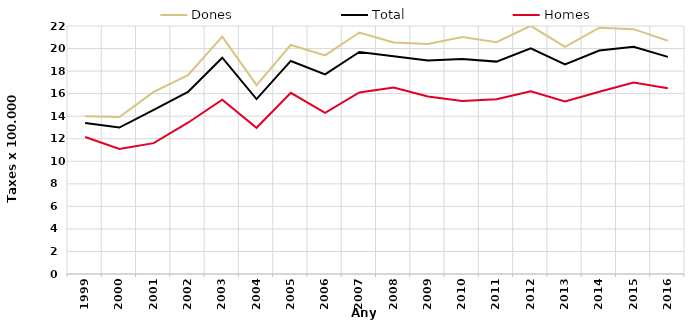
| Category | Dones | Total | Homes |
|---|---|---|---|
| 1999.0 | 14 | 13.39 | 12.15 |
| 2000.0 | 13.92 | 12.99 | 11.1 |
| 2001.0 | 16.16 | 14.56 | 11.61 |
| 2002.0 | 17.64 | 16.15 | 13.42 |
| 2003.0 | 21.06 | 19.19 | 15.46 |
| 2004.0 | 16.75 | 15.52 | 12.97 |
| 2005.0 | 20.32 | 18.9 | 16.07 |
| 2006.0 | 19.39 | 17.71 | 14.29 |
| 2007.0 | 21.42 | 19.7 | 16.1 |
| 2008.0 | 20.54 | 19.31 | 16.55 |
| 2009.0 | 20.4 | 18.93 | 15.75 |
| 2010.0 | 21.03 | 19.08 | 15.35 |
| 2011.0 | 20.56 | 18.84 | 15.51 |
| 2012.0 | 22.02 | 20.02 | 16.2 |
| 2013.0 | 20.15 | 18.6 | 15.3 |
| 2014.0 | 21.85 | 19.82 | 16.16 |
| 2015.0 | 21.72 | 20.15 | 16.98 |
| 2016.0 | 20.69 | 19.26 | 16.47 |